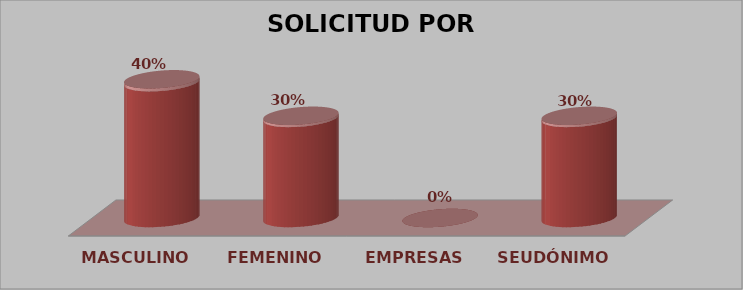
| Category | SOLICITUD POR GÉNERO | Series 1 |
|---|---|---|
| MASCULINO | 19 | 0.404 |
| FEMENINO | 14 | 0.298 |
| EMPRESAS | 0 | 0 |
| SEUDÓNIMO | 14 | 0.298 |